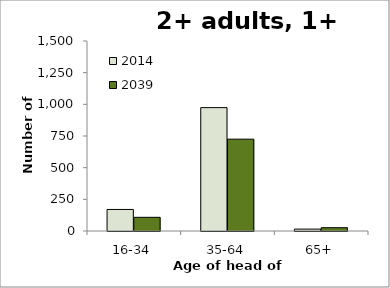
| Category | 2014 | 2039 |
|---|---|---|
| 16-34 | 170 | 108 |
| 35-64 | 974 | 725 |
| 65+ | 15 | 26 |